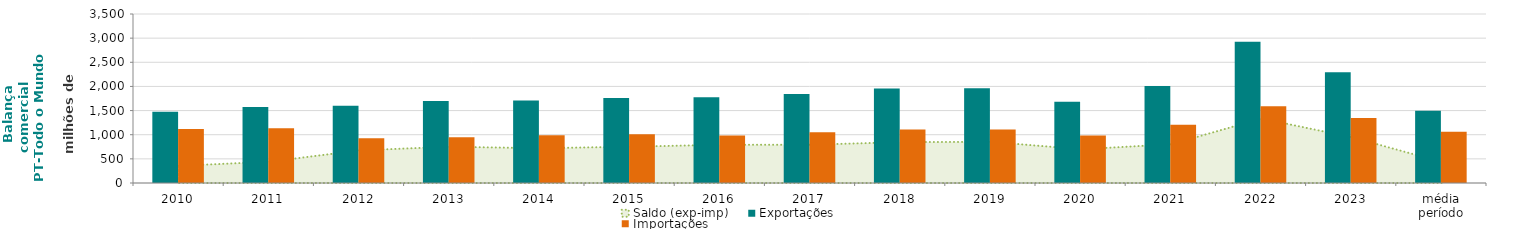
| Category | Exportações  | Importações  |
|---|---|---|
| 2010 | 1474.156 | 1118.572 |
| 2011 | 1572.212 | 1132.138 |
| 2012 | 1601.243 | 924.997 |
| 2013 | 1696.977 | 945.952 |
| 2014 | 1707.833 | 987.107 |
| 2015 | 1762.072 | 1010.417 |
| 2016 | 1776.723 | 984.994 |
| 2017 | 1842.147 | 1050.289 |
| 2018 | 1954.896 | 1108.035 |
| 2019 | 1961.624 | 1109.152 |
| 2020 | 1681.733 | 982.775 |
| 2021 | 2008.631 | 1206.542 |
| 2022 | 2924.912 | 1589.911 |
| 2023 | 2295.938 | 1348.657 |
| média período | 1498.731 | 1063.068 |